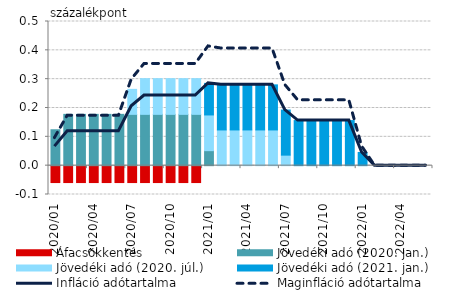
| Category | Áfacsökkentés | Jövedéki adó (2020. jan.) | Jövedéki adó (2020. júl.) | Jövedéki adó (2021. jan.) |
|---|---|---|---|---|
| 2020-01-01 | -0.059 | 0.125 | 0 | 0 |
| 2020-02-01 | -0.059 | 0.178 | 0 | 0 |
| 2020-03-01 | -0.059 | 0.178 | 0 | 0 |
| 2020-04-01 | -0.059 | 0.178 | 0 | 0 |
| 2020-05-01 | -0.059 | 0.178 | 0 | 0 |
| 2020-06-01 | -0.059 | 0.178 | 0 | 0 |
| 2020-07-01 | -0.059 | 0.178 | 0.087 | 0 |
| 2020-08-01 | -0.059 | 0.178 | 0.124 | 0 |
| 2020-09-01 | -0.059 | 0.178 | 0.124 | 0 |
| 2020-10-01 | -0.059 | 0.178 | 0.124 | 0 |
| 2020-11-01 | -0.059 | 0.178 | 0.124 | 0 |
| 2020-12-01 | -0.059 | 0.178 | 0.124 | 0 |
| 2021-01-01 | 0 | 0.052 | 0.124 | 0.109 |
| 2021-02-01 | 0 | 0 | 0.124 | 0.156 |
| 2021-03-01 | 0 | 0 | 0.124 | 0.156 |
| 2021-04-01 | 0 | 0 | 0.124 | 0.156 |
| 2021-05-01 | 0 | 0 | 0.124 | 0.156 |
| 2021-06-01 | 0 | 0 | 0.124 | 0.156 |
| 2021-07-01 | 0 | 0 | 0.036 | 0.156 |
| 2021-08-01 | 0 | 0 | 0 | 0.156 |
| 2021-09-01 | 0 | 0 | 0 | 0.156 |
| 2021-10-01 | 0 | 0 | 0 | 0.156 |
| 2021-11-01 | 0 | 0 | 0 | 0.156 |
| 2021-12-01 | 0 | 0 | 0 | 0.156 |
| 2022-01-01 | 0 | 0 | 0 | 0.046 |
| 2022-02-01 | 0 | 0 | 0 | 0 |
| 2022-03-01 | 0 | 0 | 0 | 0 |
| 2022-04-01 | 0 | 0 | 0 | 0 |
| 2022-05-01 | 0 | 0 | 0 | 0 |
| 2022-06-01 | 0 | 0 | 0 | 0 |